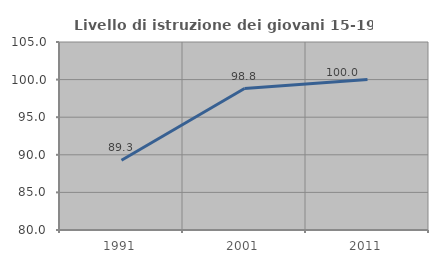
| Category | Livello di istruzione dei giovani 15-19 anni |
|---|---|
| 1991.0 | 89.286 |
| 2001.0 | 98.81 |
| 2011.0 | 100 |